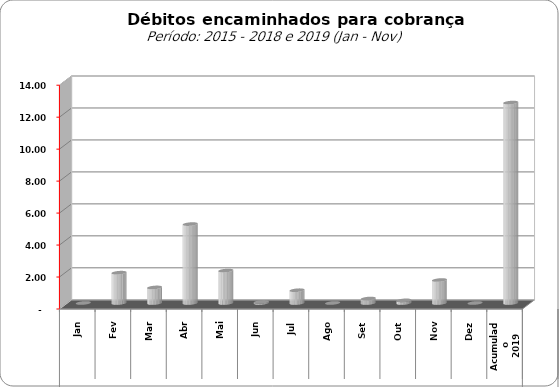
| Category |  3.309.443,02   3.859.728,44   11.181.928,25   7.600.526,01   31.248.623,50   9.830.198,34   20.083.556,95   23.931.734,08   -     1.897.202,11   974.309,37   4.937.737,42   2.030.400,14   66.339,49   799.707,68   -     280.398,44   165.655,52   1.436.970 |
|---|---|
| 0 | 0 |
| 1 | 1897202.11 |
| 2 | 974309.37 |
| 3 | 4937737.42 |
| 4 | 2030400.14 |
| 5 | 66339.49 |
| 6 | 799707.68 |
| 7 | 0 |
| 8 | 280398.44 |
| 9 | 165655.52 |
| 10 | 1436970.96 |
| 11 | 0 |
| 12 | 12540261.37 |